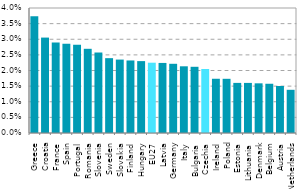
| Category | Series 0 |
|---|---|
| Greece | 0.037 |
| Croatia | 0.031 |
| France | 0.029 |
| Spain | 0.029 |
| Portugal | 0.028 |
| Romania | 0.027 |
| Slovenia | 0.026 |
| Sweden | 0.024 |
| Slovakia | 0.023 |
| Finland | 0.023 |
| Hungary | 0.023 |
| EU27 | 0.022 |
| Latvia | 0.022 |
| Germany | 0.022 |
| Italy | 0.021 |
| Bulgaria | 0.021 |
| Czechia | 0.02 |
| Ireland | 0.017 |
| Poland | 0.017 |
| Estonia | 0.016 |
| Lithuania | 0.016 |
| Denmark | 0.016 |
| Belgium | 0.016 |
| Austria | 0.015 |
| Netherlands | 0.014 |